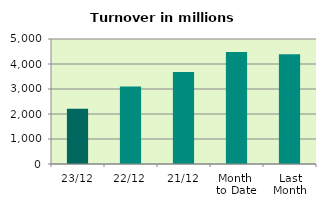
| Category | Series 0 |
|---|---|
| 23/12 | 2208.786 |
| 22/12 | 3101.713 |
| 21/12 | 3681.103 |
| Month 
to Date | 4477.098 |
| Last
Month | 4388.555 |